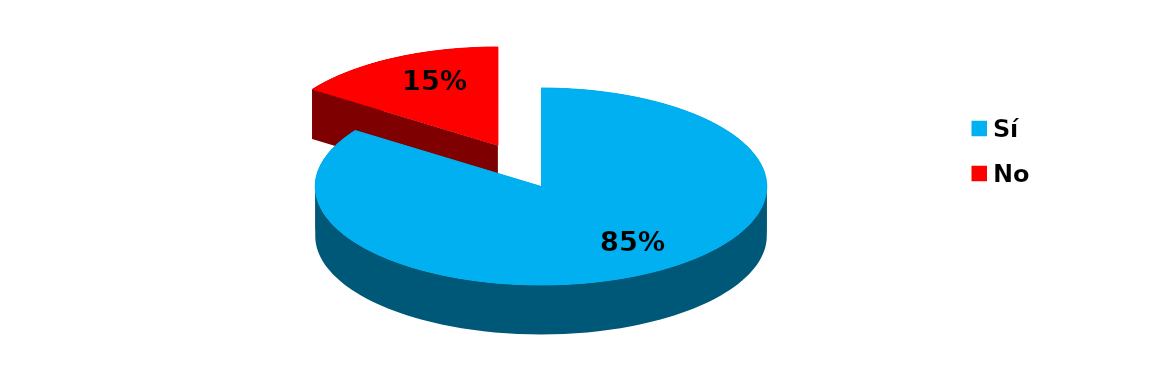
| Category | Series 0 |
|---|---|
| Sí | 11 |
| No | 2 |